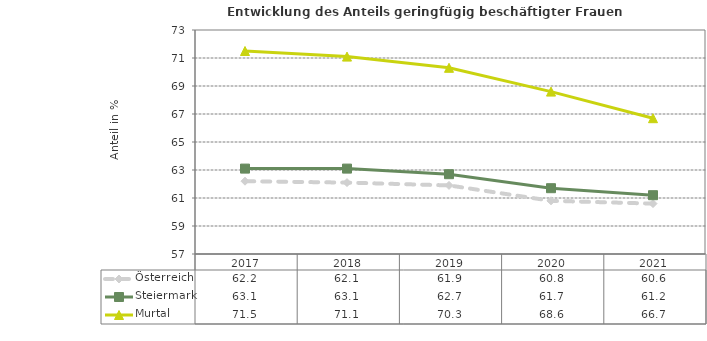
| Category | Österreich | Steiermark | Murtal |
|---|---|---|---|
| 2021.0 | 60.6 | 61.2 | 66.7 |
| 2020.0 | 60.8 | 61.7 | 68.6 |
| 2019.0 | 61.9 | 62.7 | 70.3 |
| 2018.0 | 62.1 | 63.1 | 71.1 |
| 2017.0 | 62.2 | 63.1 | 71.5 |